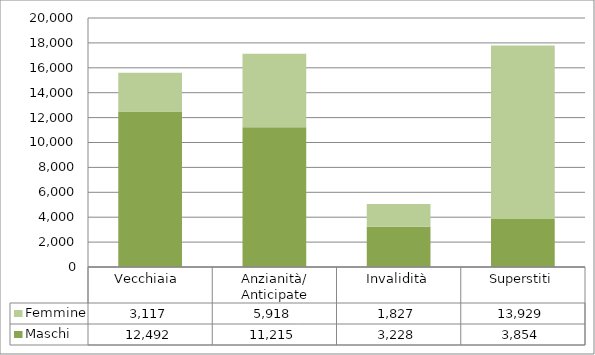
| Category | Maschi | Femmine |
|---|---|---|
| Vecchiaia  | 12492 | 3117 |
| Anzianità/ Anticipate | 11215 | 5918 |
| Invalidità | 3228 | 1827 |
| Superstiti | 3854 | 13929 |